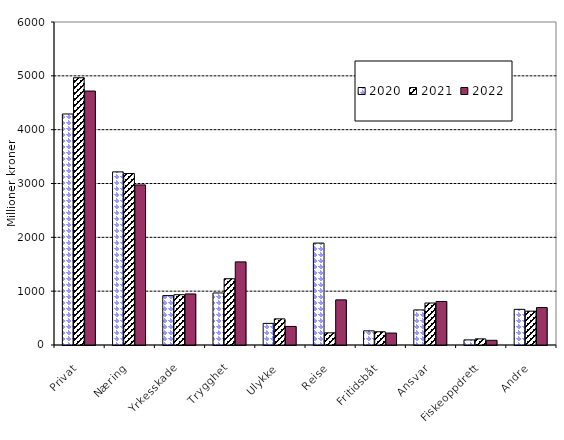
| Category | 2020 | 2021 | 2022 |
|---|---|---|---|
| Privat | 4291.207 | 4964.318 | 4717.422 |
| Næring | 3215.997 | 3185.211 | 2973.657 |
| Yrkesskade | 917.481 | 934.056 | 948.379 |
| Trygghet | 966.103 | 1230.79 | 1543.898 |
| Ulykke | 401.426 | 485.77 | 344.967 |
| Reise | 1893.541 | 225.67 | 838.339 |
| Fritidsbåt | 262.931 | 246.519 | 222.005 |
| Ansvar | 651.869 | 780.018 | 808.894 |
| Fiskeoppdrett | 94.892 | 113.797 | 87.348 |
| Andre | 662.498 | 628.909 | 695.607 |